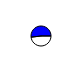
| Category | Series 0 |
|---|---|
| 0 | 3127883 |
| 1 | 3375759 |